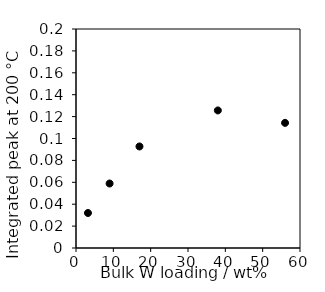
| Category | Series 0 |
|---|---|
| 3.2 | 0.032 |
| 9.0 | 0.059 |
| 17.0 | 0.093 |
| 38.0 | 0.126 |
| 56.0 | 0.114 |